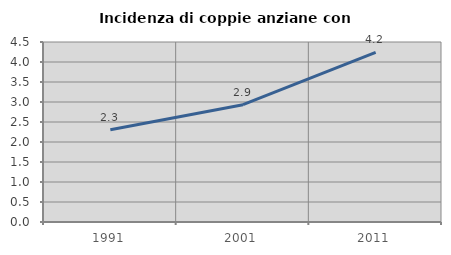
| Category | Incidenza di coppie anziane con figli |
|---|---|
| 1991.0 | 2.308 |
| 2001.0 | 2.934 |
| 2011.0 | 4.238 |